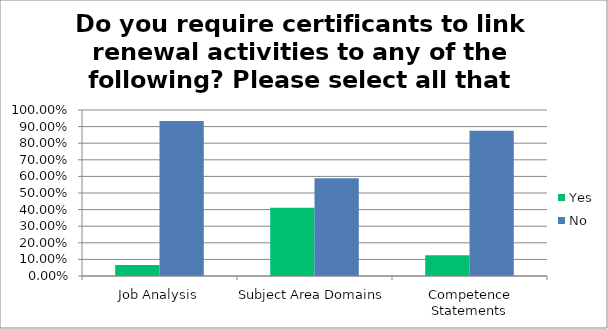
| Category | Yes | No |
|---|---|---|
| Job Analysis | 0.067 | 0.933 |
| Subject Area Domains | 0.412 | 0.588 |
| Competence Statements | 0.125 | 0.875 |